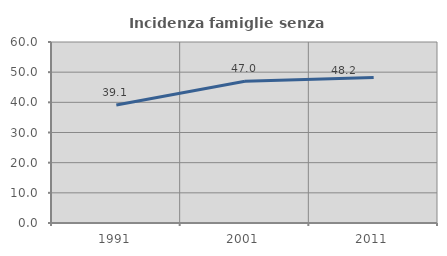
| Category | Incidenza famiglie senza nuclei |
|---|---|
| 1991.0 | 39.123 |
| 2001.0 | 46.968 |
| 2011.0 | 48.246 |